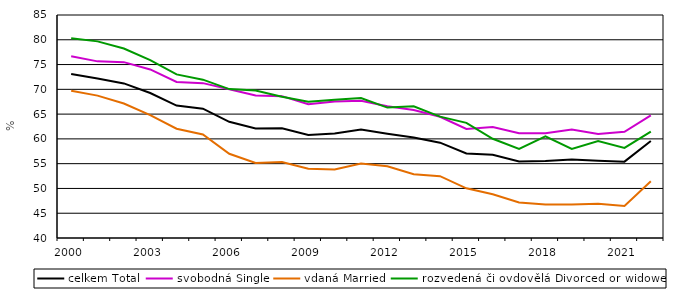
| Category | celkem | svobodná | vdaná | rozvedená či ovdovělá |
|---|---|---|---|---|
| 2000.0 | 73.091 | 76.655 | 69.708 | 80.317 |
| 2001.0 | 72.193 | 75.644 | 68.729 | 79.678 |
| 2002.0 | 71.193 | 75.488 | 67.145 | 78.235 |
| 2003.0 | 69.256 | 74.014 | 64.787 | 75.909 |
| 2004.0 | 66.726 | 71.484 | 62.058 | 73.022 |
| 2005.0 | 66.094 | 71.249 | 60.881 | 71.951 |
| 2006.0 | 63.445 | 70.015 | 57.003 | 70.048 |
| 2007.0 | 62.111 | 68.755 | 55.158 | 69.744 |
| 2008.0 | 62.153 | 68.621 | 55.322 | 68.508 |
| 2009.0 | 60.788 | 67.002 | 53.96 | 67.502 |
| 2010.0 | 61.106 | 67.539 | 53.815 | 67.877 |
| 2011.0 | 61.895 | 67.711 | 55.013 | 68.253 |
| 2012.0 | 61.039 | 66.575 | 54.473 | 66.314 |
| 2013.0 | 60.27 | 65.834 | 52.866 | 66.594 |
| 2014.0 | 59.241 | 64.47 | 52.476 | 64.497 |
| 2015.0 | 57.054 | 61.993 | 50.022 | 63.228 |
| 2016.0 | 56.808 | 62.397 | 48.829 | 60.017 |
| 2017.0 | 55.452 | 61.135 | 47.185 | 57.989 |
| 2018.0 | 55.529 | 61.119 | 46.76 | 60.497 |
| 2019.0 | 55.845 | 61.884 | 46.749 | 57.984 |
| 2020.0 | 55.605 | 60.992 | 46.899 | 59.563 |
| 2021.0 | 55.41 | 61.42 | 46.465 | 58.193 |
| 2022.0 | 59.562 | 64.753 | 51.439 | 61.455 |